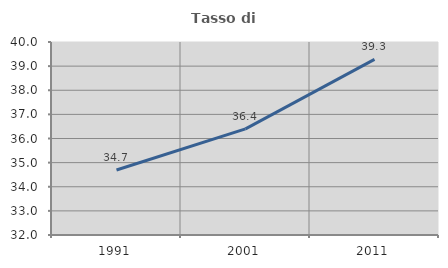
| Category | Tasso di occupazione   |
|---|---|
| 1991.0 | 34.694 |
| 2001.0 | 36.402 |
| 2011.0 | 39.278 |